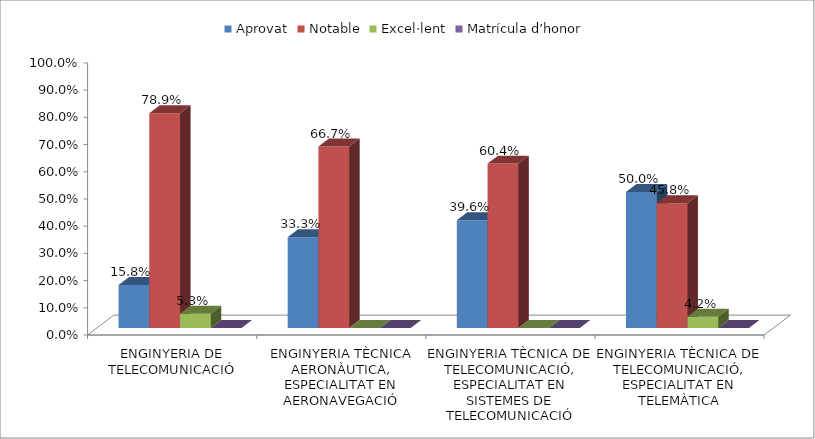
| Category | Aprovat | Notable | Excel·lent | Matrícula d’honor |
|---|---|---|---|---|
| ENGINYERIA DE TELECOMUNICACIÓ | 0.158 | 0.789 | 0.053 | 0 |
| ENGINYERIA TÈCNICA AERONÀUTICA, ESPECIALITAT EN AERONAVEGACIÓ | 0.333 | 0.667 | 0 | 0 |
| ENGINYERIA TÈCNICA DE TELECOMUNICACIÓ, ESPECIALITAT EN SISTEMES DE TELECOMUNICACIÓ | 0.396 | 0.604 | 0 | 0 |
| ENGINYERIA TÈCNICA DE TELECOMUNICACIÓ, ESPECIALITAT EN TELEMÀTICA | 0.5 | 0.458 | 0.042 | 0 |